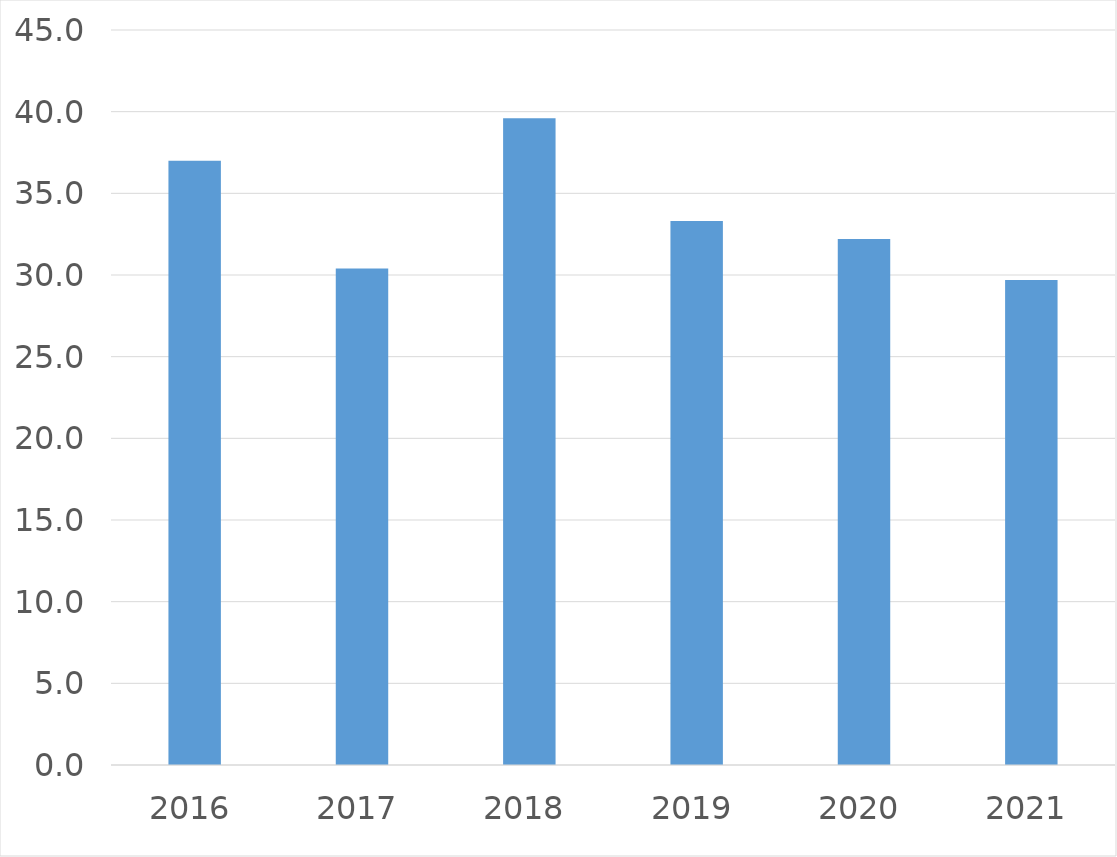
| Category | Series 0 |
|---|---|
| 2016 | 37 |
| 2017 | 30.4 |
| 2018 | 39.6 |
| 2019 | 33.3 |
| 2020 | 32.2 |
| 2021 | 29.7 |